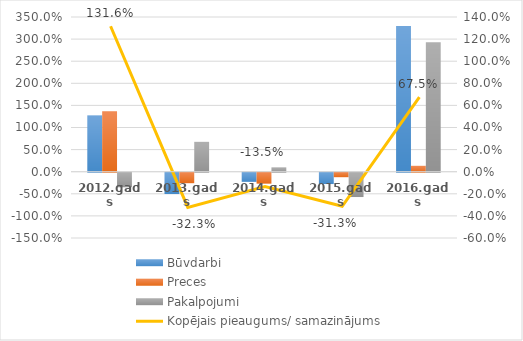
| Category | Būvdarbi | Preces | Pakalpojumi |
|---|---|---|---|
| 2012.gads | 1.275 | 1.368 | -0.332 |
| 2013.gads | -0.483 | -0.239 | 0.675 |
| 2014.gads | -0.207 | -0.248 | 0.095 |
| 2015.gads | -0.257 | -0.103 | -0.551 |
| 2016.gads | 3.298 | 0.133 | 2.926 |